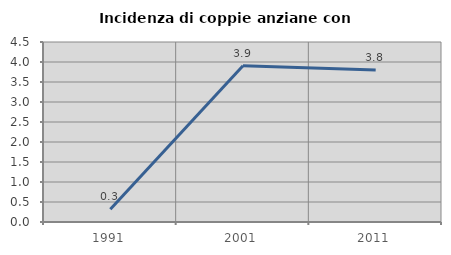
| Category | Incidenza di coppie anziane con figli |
|---|---|
| 1991.0 | 0.317 |
| 2001.0 | 3.904 |
| 2011.0 | 3.801 |